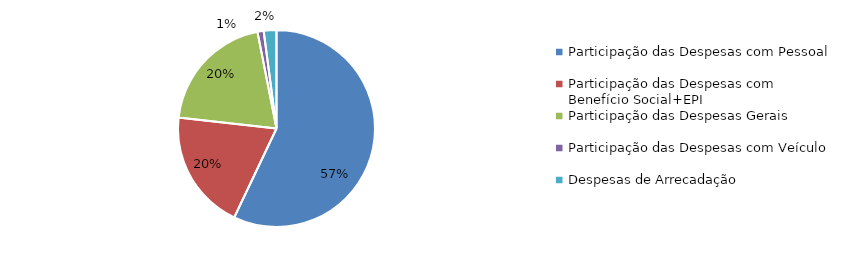
| Category | Series 0 |
|---|---|
| Participação das Despesas com Pessoal | 0.571 |
| Participação das Despesas com Benefício Social+EPI | 0.197 |
| Participação das Despesas Gerais | 0.201 |
| Participação das Despesas com Veículo | 0.01 |
| Despesas de Arrecadação | 0.021 |